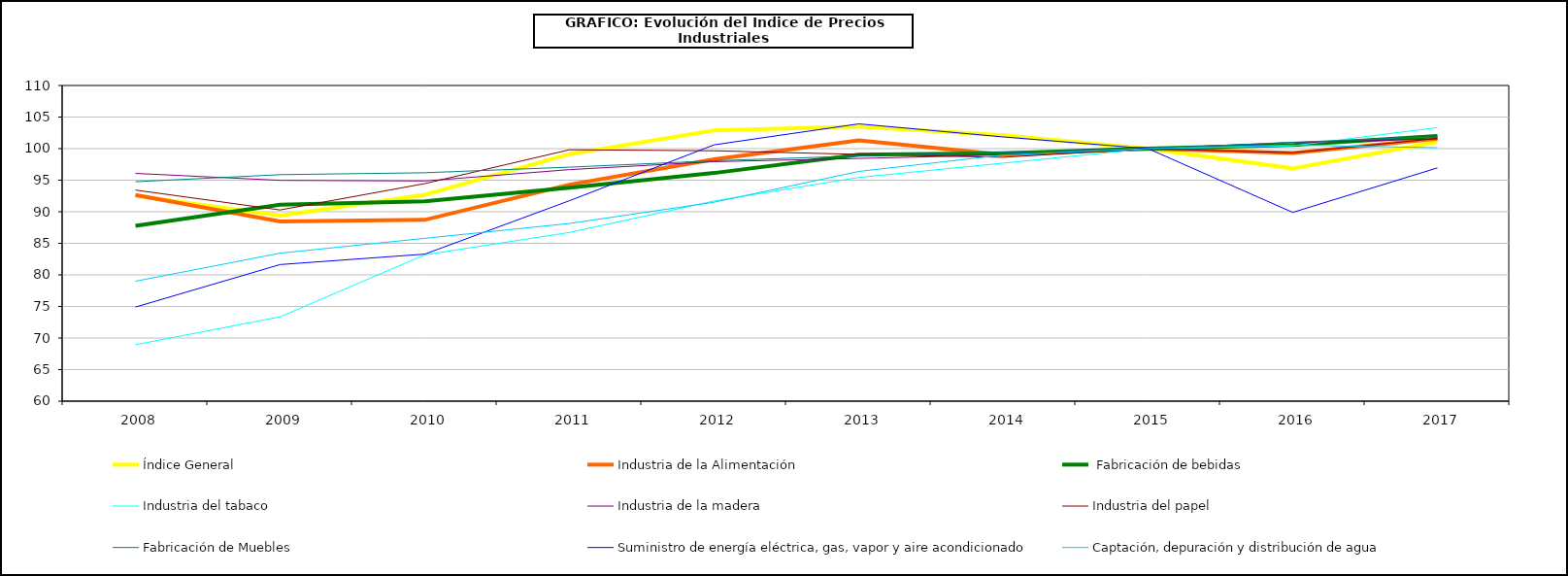
| Category | Índice General | Industria de la Alimentación |  Fabricación de bebidas | Industria del tabaco | Industria de la madera  | Industria del papel | Fabricación de Muebles | Suministro de energía eléctrica, gas, vapor y aire acondicionado | Captación, depuración y distribución de agua |
|---|---|---|---|---|---|---|---|---|---|
|    2008 | 92.547 | 92.645 | 87.779 | 68.936 | 96.076 | 93.435 | 94.76 | 74.9 | 78.997 |
|    2009 | 89.398 | 88.468 | 91.123 | 73.356 | 94.977 | 90.282 | 95.874 | 81.636 | 83.437 |
|    2010 | 92.692 | 88.718 | 91.66 | 83.184 | 94.876 | 94.456 | 96.179 | 83.288 | 85.79 |
|    2011 | 99.126 | 94.287 | 93.8 | 86.719 | 96.675 | 99.819 | 97.061 | 91.746 | 88.143 |
|    2012 | 102.869 | 98.31 | 96.137 | 91.704 | 97.934 | 99.661 | 98.074 | 100.6 | 91.511 |
|    2013 | 103.496 | 101.306 | 99.026 | 95.432 | 98.444 | 99.086 | 98.846 | 103.92 | 96.382 |
|    2014 | 102.112 | 99.053 | 99.281 | 97.706 | 98.997 | 98.623 | 99.459 | 101.849 | 98.997 |
|    2015 | 100 | 100 | 100 | 100 | 100 | 100 | 100 | 100 | 100 |
|    2016 | 96.869 | 99.296 | 100.581 | 100.444 | 100.967 | 99.346 | 101.015 | 89.898 | 100.556 |
|    2017 | 101.09 | 101.557 | 101.982 | 103.33 | 101.53 | 101.611 | 101.884 | 96.946 | 100.144 |